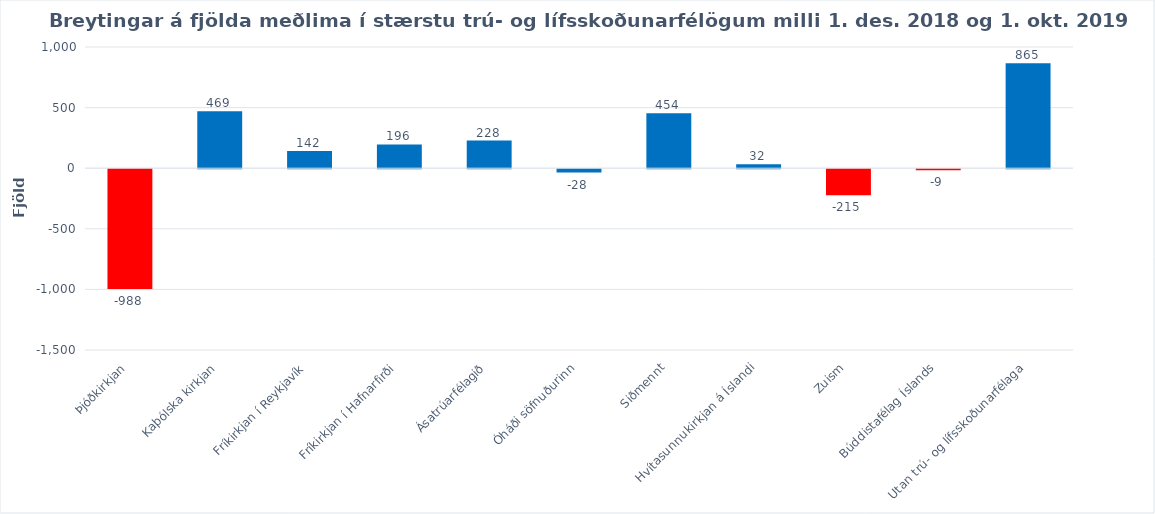
| Category | Series 0 |
|---|---|
| Þjóðkirkjan | -988 |
| Kaþólska kirkjan | 469 |
| Fríkirkjan í Reykjavík | 142 |
| Fríkirkjan í Hafnarfirði | 196 |
| Ásatrúarfélagið | 228 |
| Óháði söfnuðurinn | -28 |
| Siðmennt | 454 |
| Hvítasunnukirkjan á Íslandi | 32 |
| Zuism | -215 |
| Búddistafélag Íslands | -9 |
| Utan trú- og lífsskoðunarfélaga | 865 |